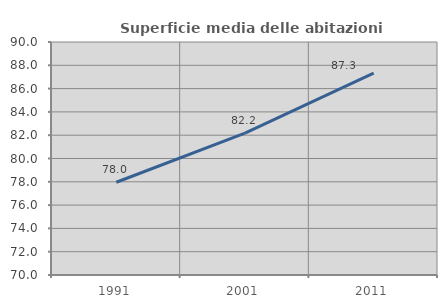
| Category | Superficie media delle abitazioni occupate |
|---|---|
| 1991.0 | 77.959 |
| 2001.0 | 82.171 |
| 2011.0 | 87.329 |